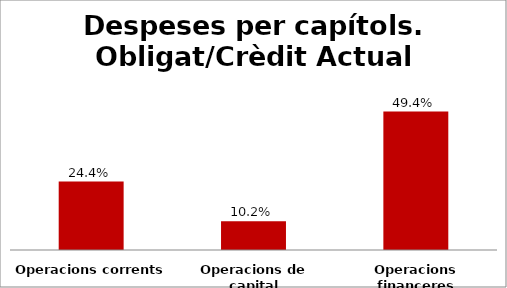
| Category | Series 0 |
|---|---|
| Operacions corrents | 0.244 |
| Operacions de capital | 0.102 |
| Operacions financeres | 0.494 |